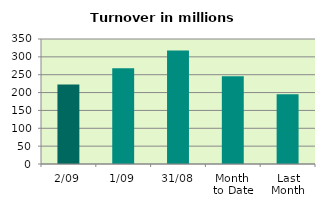
| Category | Series 0 |
|---|---|
| 2/09 | 222.789 |
| 1/09 | 268.392 |
| 31/08 | 318.119 |
| Month 
to Date | 245.59 |
| Last
Month | 195.366 |